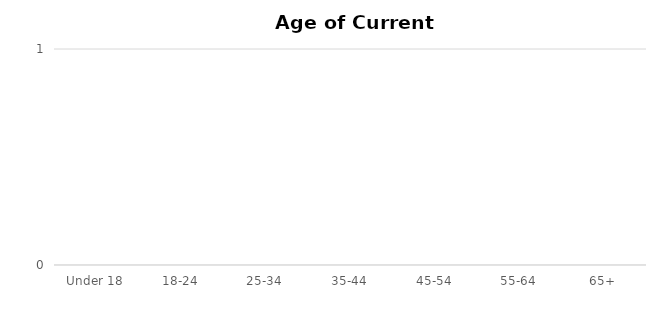
| Category | Series 0 |
|---|---|
| Under 18 | 0 |
| 18-24 | 0 |
| 25-34 | 0 |
| 35-44 | 0 |
| 45-54 | 0 |
| 55-64 | 0 |
| 65+ | 0 |